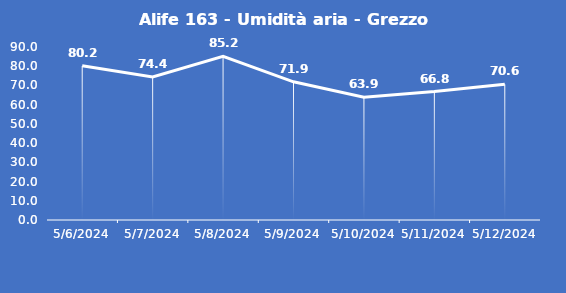
| Category | Alife 163 - Umidità aria - Grezzo (%) |
|---|---|
| 5/6/24 | 80.2 |
| 5/7/24 | 74.4 |
| 5/8/24 | 85.2 |
| 5/9/24 | 71.9 |
| 5/10/24 | 63.9 |
| 5/11/24 | 66.8 |
| 5/12/24 | 70.6 |